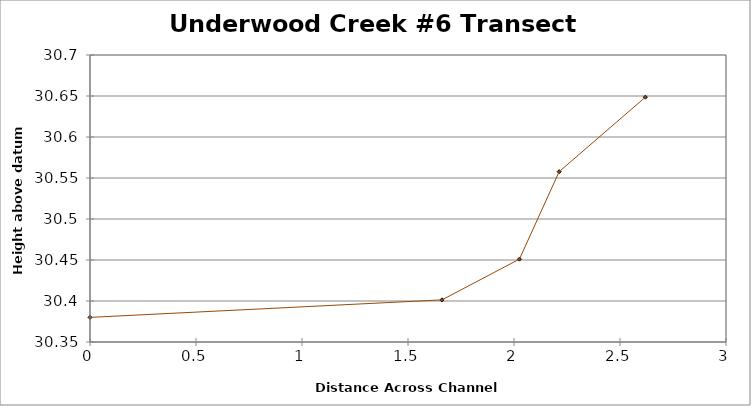
| Category | Series 0 |
|---|---|
| 0.0 | 30.38 |
| 1.6602960728146716 | 30.401 |
| 2.0255483025356438 | 30.451 |
| 2.213028206711789 | 30.558 |
| 2.619763358453869 | 30.649 |